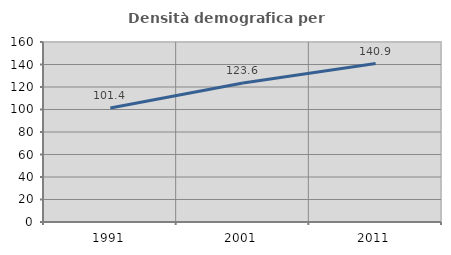
| Category | Densità demografica |
|---|---|
| 1991.0 | 101.404 |
| 2001.0 | 123.616 |
| 2011.0 | 140.879 |